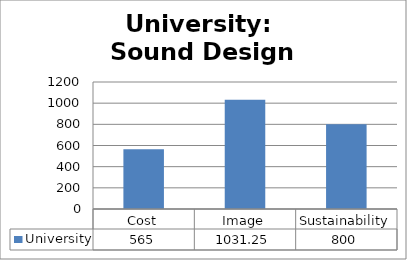
| Category | University |
|---|---|
| Cost | 565 |
| Image | 1031.25 |
| Sustainability | 800 |